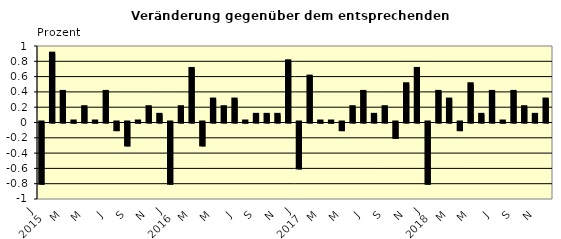
| Category | Series 0 |
|---|---|
| 0 | -0.8 |
| 1 | 0.9 |
| 2 | 0.4 |
| 3 | 0.01 |
| 4 | 0.2 |
| 5 | 0.01 |
| 6 | 0.4 |
| 7 | -0.1 |
| 8 | -0.3 |
| 9 | 0.01 |
| 10 | 0.2 |
| 11 | 0.1 |
| 12 | -0.8 |
| 13 | 0.2 |
| 14 | 0.7 |
| 15 | -0.3 |
| 16 | 0.3 |
| 17 | 0.2 |
| 18 | 0.3 |
| 19 | 0.01 |
| 20 | 0.1 |
| 21 | 0.1 |
| 22 | 0.1 |
| 23 | 0.8 |
| 24 | -0.6 |
| 25 | 0.6 |
| 26 | 0.01 |
| 27 | 0.01 |
| 28 | -0.1 |
| 29 | 0.2 |
| 30 | 0.4 |
| 31 | 0.1 |
| 32 | 0.2 |
| 33 | -0.2 |
| 34 | 0.5 |
| 35 | 0.7 |
| 36 | -0.8 |
| 37 | 0.4 |
| 38 | 0.3 |
| 39 | -0.1 |
| 40 | 0.5 |
| 41 | 0.1 |
| 42 | 0.4 |
| 43 | 0.01 |
| 44 | 0.4 |
| 45 | 0.2 |
| 46 | 0.1 |
| 47 | 0.3 |